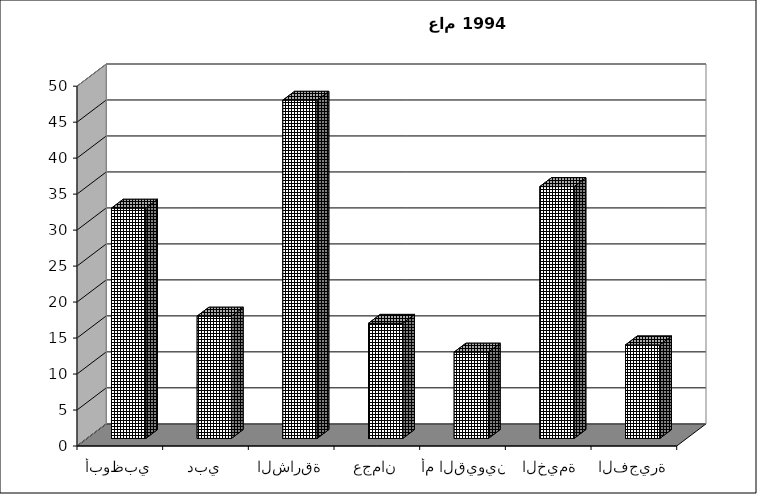
| Category | Series 0 |
|---|---|
| أبوظبي | 32 |
| دبي | 17 |
| الشارقة | 47 |
| عجمان | 16 |
| أم القيوين | 12 |
| رأس الخيمة | 35 |
| الفجيرة | 13 |